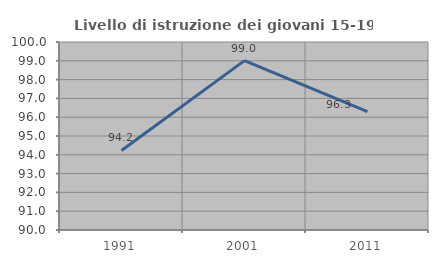
| Category | Livello di istruzione dei giovani 15-19 anni |
|---|---|
| 1991.0 | 94.231 |
| 2001.0 | 99.01 |
| 2011.0 | 96.296 |